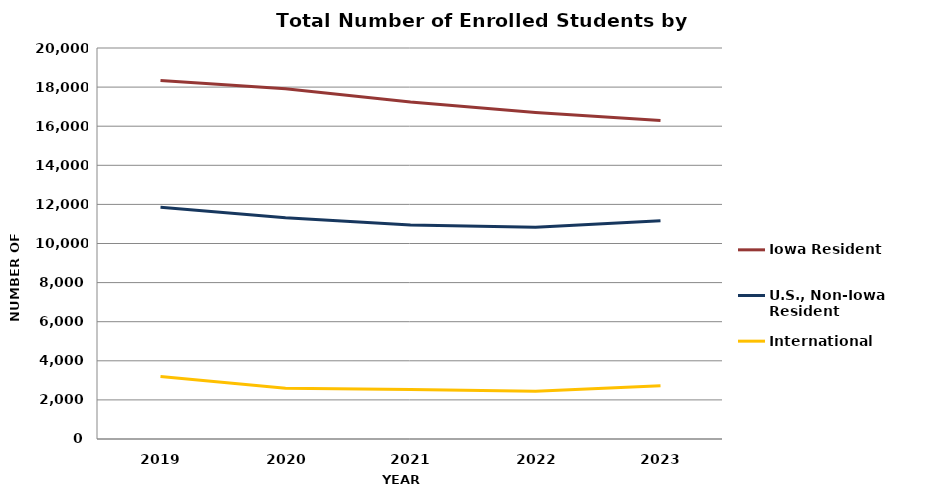
| Category | Iowa Resident | U.S., Non-Iowa Resident | International |
|---|---|---|---|
| 2019.0 | 18341 | 11852 | 3198 |
| 2020.0 | 17911 | 11322 | 2592 |
| 2021.0 | 17232 | 10944 | 2532 |
| 2022.0 | 16696 | 10830 | 2443 |
| 2023.0 | 16297 | 11162 | 2718 |